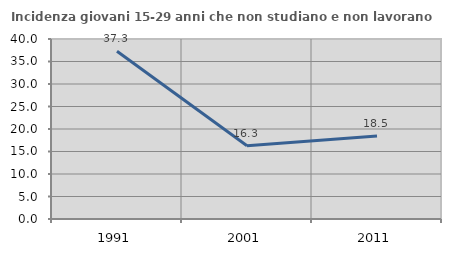
| Category | Incidenza giovani 15-29 anni che non studiano e non lavorano  |
|---|---|
| 1991.0 | 37.293 |
| 2001.0 | 16.279 |
| 2011.0 | 18.462 |